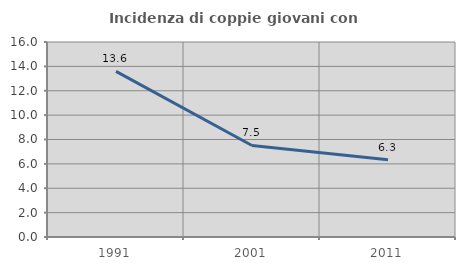
| Category | Incidenza di coppie giovani con figli |
|---|---|
| 1991.0 | 13.594 |
| 2001.0 | 7.51 |
| 2011.0 | 6.335 |